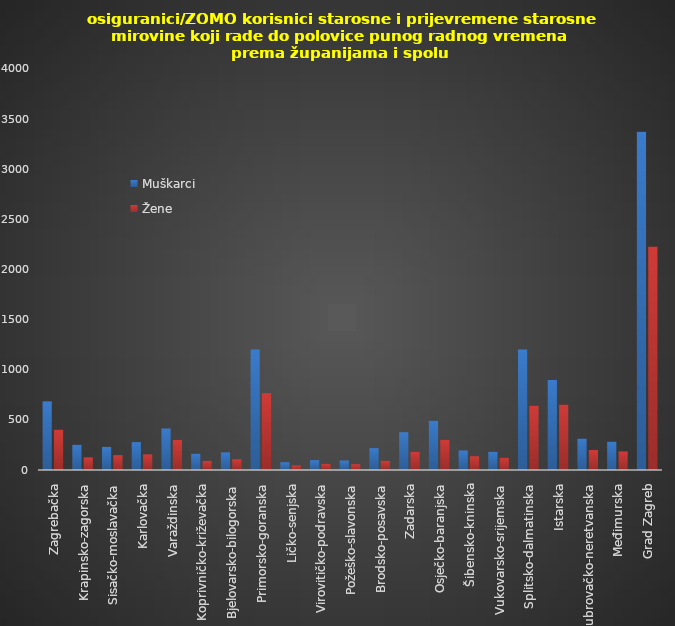
| Category | Muškarci | Žene |
|---|---|---|
| Zagrebačka | 685 | 403 |
| Krapinsko-zagorska | 252 | 126 |
| Sisačko-moslavačka | 231 | 148 |
| Karlovačka | 278 | 156 |
| Varaždinska | 414 | 300 |
| Koprivničko-križevačka | 163 | 92 |
| Bjelovarsko-bilogorska | 176 | 107 |
| Primorsko-goranska | 1203 | 767 |
| Ličko-senjska | 78 | 46 |
| Virovitičko-podravska | 98 | 63 |
| Požeško-slavonska | 95 | 58 |
| Brodsko-posavska | 218 | 93 |
| Zadarska | 377 | 184 |
| Osječko-baranjska | 493 | 301 |
| Šibensko-kninska | 195 | 137 |
| Vukovarsko-srijemska | 182 | 123 |
| Splitsko-dalmatinska | 1202 | 643 |
| Istarska | 898 | 653 |
| Dubrovačko-neretvanska | 314 | 199 |
| Međimurska | 283 | 185 |
| Grad Zagreb | 3374 | 2229 |